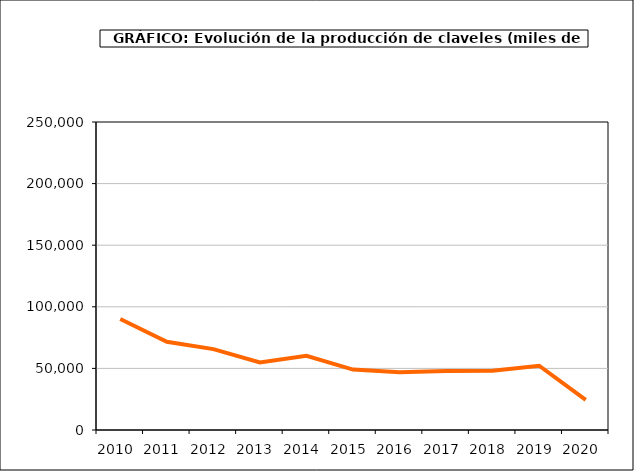
| Category | producción |
|---|---|
| 2010.0 | 90126 |
| 2011.0 | 71606 |
| 2012.0 | 65631 |
| 2013.0 | 54800 |
| 2014.0 | 60277 |
| 2015.0 | 49065 |
| 2016.0 | 46856 |
| 2017.0 | 47990 |
| 2018.0 | 48043 |
| 2019.0 | 52184 |
| 2020.0 | 24363 |